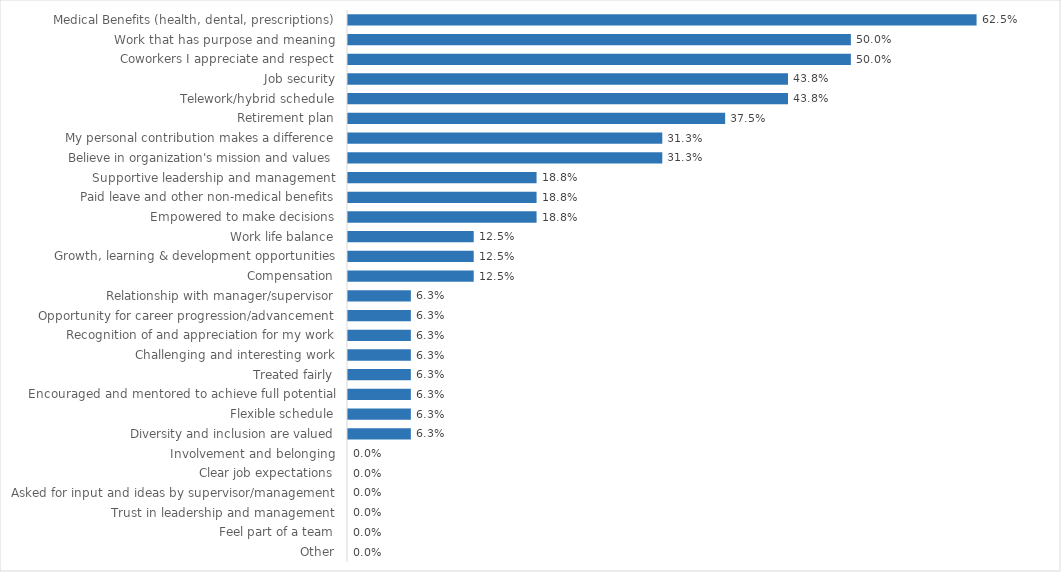
| Category | Libraries |
|---|---|
| Medical Benefits (health, dental, prescriptions) | 0.625 |
| Work that has purpose and meaning | 0.5 |
| Coworkers I appreciate and respect | 0.5 |
| Job security | 0.438 |
| Telework/hybrid schedule | 0.438 |
| Retirement plan | 0.375 |
| My personal contribution makes a difference | 0.312 |
| Believe in organization's mission and values | 0.312 |
| Supportive leadership and management | 0.188 |
| Paid leave and other non-medical benefits | 0.188 |
| Empowered to make decisions | 0.188 |
| Work life balance | 0.125 |
| Growth, learning & development opportunities | 0.125 |
| Compensation | 0.125 |
| Relationship with manager/supervisor | 0.062 |
| Opportunity for career progression/advancement | 0.062 |
| Recognition of and appreciation for my work | 0.062 |
| Challenging and interesting work | 0.062 |
| Treated fairly | 0.062 |
| Encouraged and mentored to achieve full potential | 0.062 |
| Flexible schedule | 0.062 |
| Diversity and inclusion are valued | 0.062 |
| Involvement and belonging | 0 |
| Clear job expectations | 0 |
| Asked for input and ideas by supervisor/management | 0 |
| Trust in leadership and management | 0 |
| Feel part of a team | 0 |
| Other | 0 |